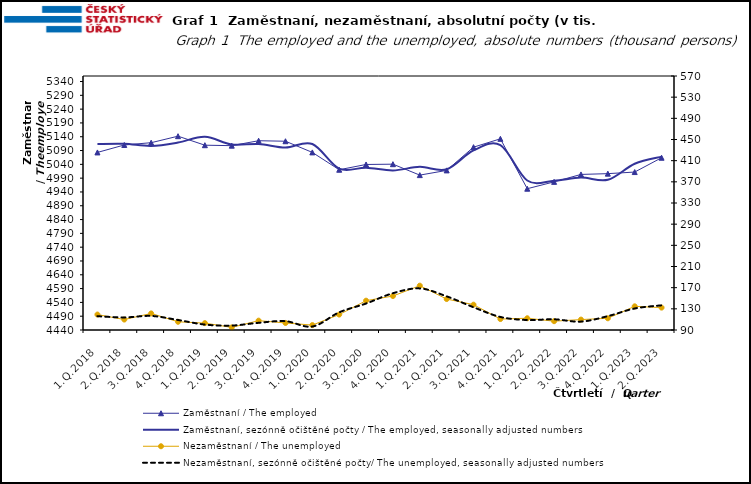
| Category | Zaměstnaní / The employed | Zaměstnaní, sezónně očištěné počty / The employed, seasonally adjusted numbers |
|---|---|---|
| 1.Q.2018 | 5083.179 | 5113.603 |
| 2.Q.2018 | 5110.163 | 5114.414 |
| 3.Q.2018 | 5118.428 | 5106.763 |
| 4.Q.2018 | 5142.05 | 5119.044 |
| 1.Q.2019 | 5109.352 | 5139.926 |
| 2.Q.2019 | 5107.692 | 5111.938 |
| 3.Q.2019 | 5125.549 | 5113.851 |
| 4.Q.2019 | 5123.768 | 5100.855 |
| 1.Q.2020 | 5083.305 | 5113.75 |
| 2.Q.2020 | 5020.458 | 5024.615 |
| 3.Q.2020 | 5039.545 | 5028.028 |
| 4.Q.2020 | 5040.581 | 5018.038 |
| 1.Q.2021 | 5001.014 | 5030.988 |
| 2.Q.2021 | 5018.083 | 5022.228 |
| 3.Q.2021 | 5102.241 | 5090.581 |
| 4.Q.2021 | 5132.436 | 5109.475 |
| 1.Q.2022 | 4951.782 | 4981.483 |
| 2.Q.2022 | 4976.52 | 4980.606 |
| 3.Q.2022 | 5003.507 | 4992.068 |
| 4.Q.2022 | 5006.314 | 4983.936 |
| 1.Q.2023 | 5012.111 | 5042.192 |
| 2.Q.2023 | 5063.915 | 5068.007 |